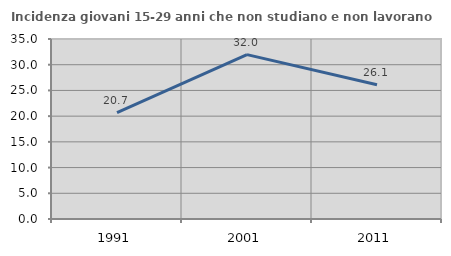
| Category | Incidenza giovani 15-29 anni che non studiano e non lavorano  |
|---|---|
| 1991.0 | 20.676 |
| 2001.0 | 31.958 |
| 2011.0 | 26.103 |